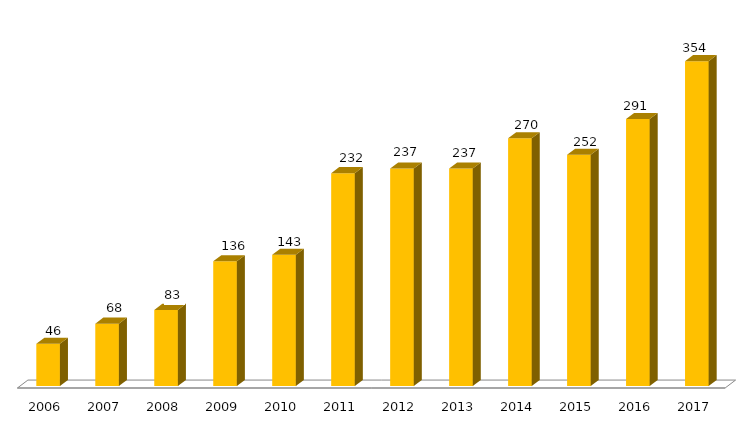
| Category | Programa |
|---|---|
| 2006.0 | 46 |
| 2007.0 | 68 |
| 2008.0 | 83 |
| 2009.0 | 136 |
| 2010.0 | 143 |
| 2011.0 | 232 |
| 2012.0 | 237 |
| 2013.0 | 237 |
| 2014.0 | 270 |
| 2015.0 | 252 |
| 2016.0 | 291 |
| 2017.0 | 354 |